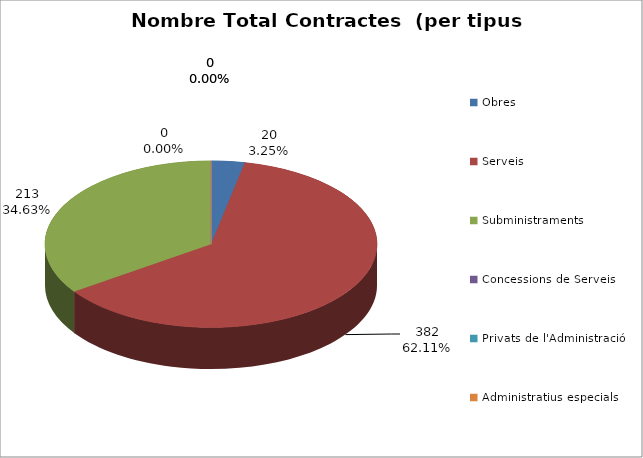
| Category | Nombre Total Contractes |
|---|---|
| Obres | 20 |
| Serveis | 382 |
| Subministraments | 213 |
| Concessions de Serveis | 0 |
| Privats de l'Administració | 0 |
| Administratius especials | 0 |